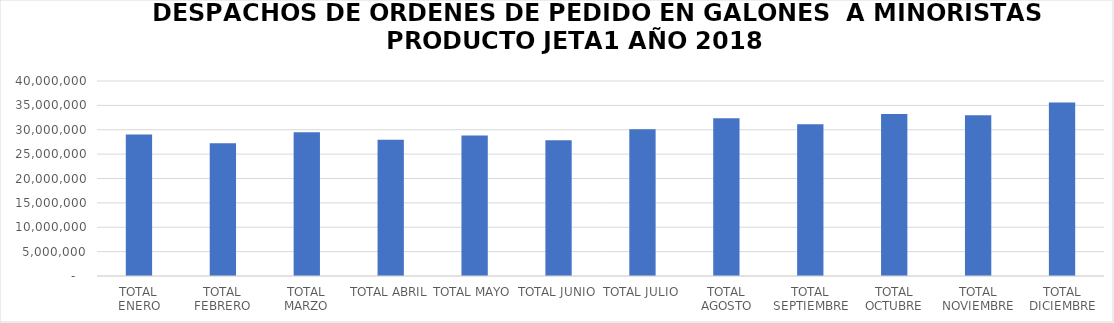
| Category | Series 0 |
|---|---|
| TOTAL ENERO | 29047809.99 |
| TOTAL FEBRERO | 27215357.74 |
| TOTAL MARZO | 29463464.1 |
| TOTAL ABRIL | 27939025.95 |
| TOTAL MAYO | 28842292.54 |
| TOTAL JUNIO | 27842612.39 |
| TOTAL JULIO | 30084846.62 |
| TOTAL AGOSTO | 32356615.28 |
| TOTAL SEPTIEMBRE | 31135426.38 |
| TOTAL OCTUBRE | 33245619.8 |
| TOTAL NOVIEMBRE | 32956995.21 |
| TOTAL DICIEMBRE | 35579425.54 |